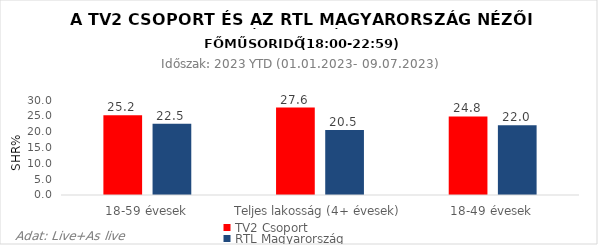
| Category | TV2 Csoport | RTL Magyarország |
|---|---|---|
| 18-59 évesek | 25.2 | 22.5 |
| Teljes lakosság (4+ évesek) | 27.6 | 20.5 |
| 18-49 évesek | 24.8 | 22 |